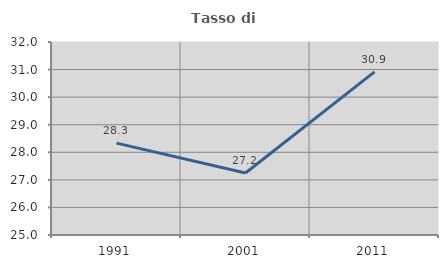
| Category | Tasso di occupazione   |
|---|---|
| 1991.0 | 28.331 |
| 2001.0 | 27.249 |
| 2011.0 | 30.917 |